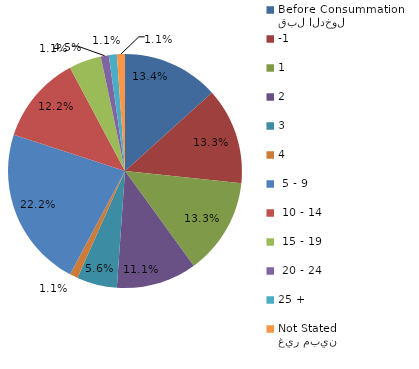
| Category | Series 0 |
|---|---|
| قبل الدخول
Before Consummation | 13.333 |
| -1 | 13.333 |
| 1 | 13.333 |
| 2 | 11.111 |
| 3 | 5.556 |
| 4 | 1.111 |
|  5 - 9 | 22.222 |
|  10 - 14 | 12.222 |
|  15 - 19 | 4.444 |
|  20 - 24 | 1.111 |
| 25 + | 1.111 |
| غير مبين
Not Stated | 1.111 |